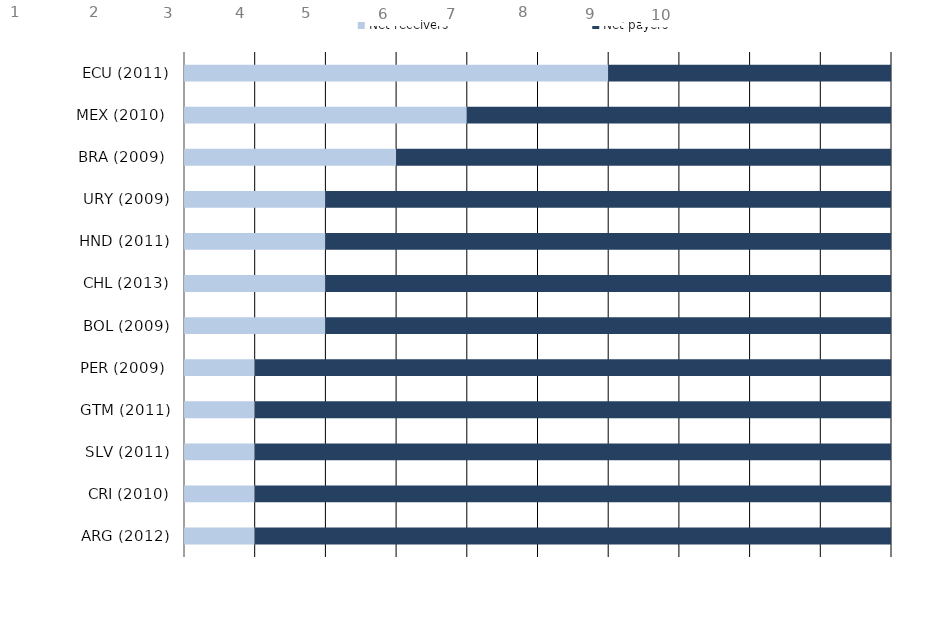
| Category | Net receivers | Net payers |
|---|---|---|
| ARG (2012) | 1 | 9 |
| CRI (2010) | 1 | 9 |
| SLV (2011) | 1 | 9 |
| GTM (2011) | 1 | 9 |
| PER (2009)  | 1 | 9 |
| BOL (2009) | 2 | 8 |
| CHL (2013) | 2 | 8 |
| HND (2011) | 2 | 8 |
| URY (2009) | 2 | 8 |
| BRA (2009)  | 3 | 7 |
| MEX (2010)  | 4 | 6 |
| ECU (2011) | 6 | 4 |